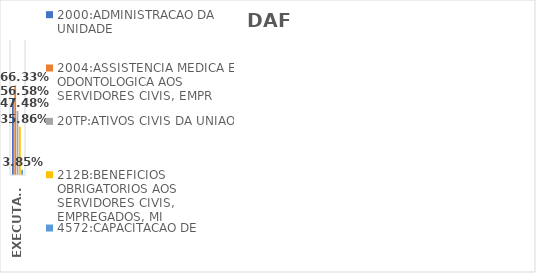
| Category | 2000:ADMINISTRACAO DA UNIDADE | 2004:ASSISTENCIA MEDICA E ODONTOLOGICA AOS SERVIDORES CIVIS, EMPR | 20TP:ATIVOS CIVIS DA UNIAO | 212B:BENEFICIOS OBRIGATORIOS AOS SERVIDORES CIVIS, EMPREGADOS, MI | 4572:CAPACITACAO DE SERVIDORES PUBLICOS FEDERAIS EM PROCESSO DE Q |
|---|---|---|---|---|---|
| EXECUTADO | 0.566 | 0.663 | 0.475 | 0.359 | 0.039 |